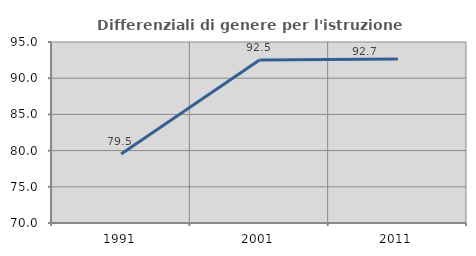
| Category | Differenziali di genere per l'istruzione superiore |
|---|---|
| 1991.0 | 79.517 |
| 2001.0 | 92.52 |
| 2011.0 | 92.66 |